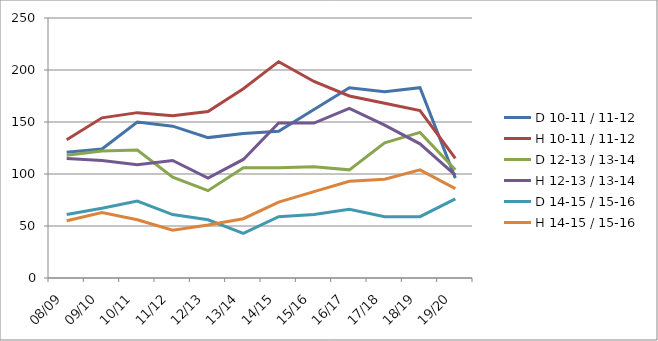
| Category | D 10-11 / 11-12 | H 10-11 / 11-12 | D 12-13 / 13-14 | H 12-13 / 13-14 | D 14-15 / 15-16 | H 14-15 / 15-16 |
|---|---|---|---|---|---|---|
| 08/09 | 121 | 133 | 118 | 115 | 61 | 55 |
| 09/10 | 124 | 154 | 122 | 113 | 67 | 63 |
| 10/11 | 150 | 159 | 123 | 109 | 74 | 56 |
| 11/12 | 146 | 156 | 97 | 113 | 61 | 46 |
| 12/13 | 135 | 160 | 84 | 96 | 56 | 51 |
| 13/14 | 139 | 182 | 106 | 114 | 43 | 57 |
| 14/15 | 141 | 208 | 106 | 149 | 59 | 73 |
| 15/16 | 162 | 189 | 107 | 149 | 61 | 83 |
| 16/17 | 183 | 175 | 104 | 163 | 66 | 93 |
| 17/18 | 179 | 168 | 130 | 147 | 59 | 95 |
| 18/19 | 183 | 161 | 140 | 129 | 59 | 104 |
| 19/20 | 96 | 115 | 104 | 99 | 76 | 86 |